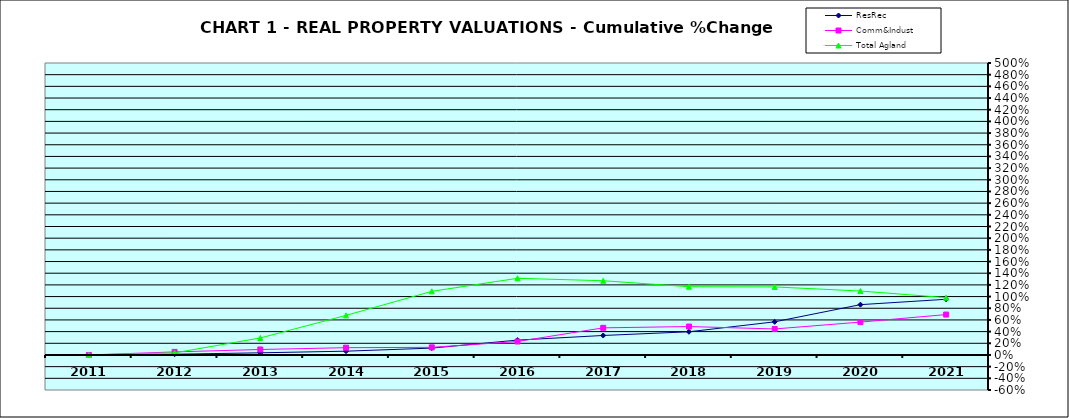
| Category | ResRec | Comm&Indust | Total Agland |
|---|---|---|---|
| 2011.0 | 0 | 0 | 0 |
| 2012.0 | 0.013 | 0.052 | 0.036 |
| 2013.0 | 0.037 | 0.094 | 0.291 |
| 2014.0 | 0.065 | 0.125 | 0.678 |
| 2015.0 | 0.118 | 0.131 | 1.089 |
| 2016.0 | 0.255 | 0.23 | 1.313 |
| 2017.0 | 0.334 | 0.464 | 1.271 |
| 2018.0 | 0.397 | 0.487 | 1.169 |
| 2019.0 | 0.568 | 0.445 | 1.165 |
| 2020.0 | 0.862 | 0.563 | 1.095 |
| 2021.0 | 0.954 | 0.692 | 0.982 |